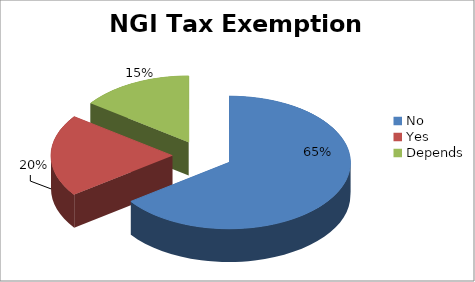
| Category | Series 0 |
|---|---|
| No | 13 |
| Yes | 4 |
| Depends | 3 |